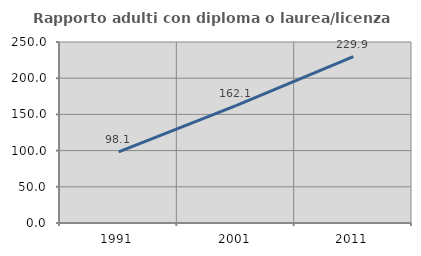
| Category | Rapporto adulti con diploma o laurea/licenza media  |
|---|---|
| 1991.0 | 98.111 |
| 2001.0 | 162.128 |
| 2011.0 | 229.935 |